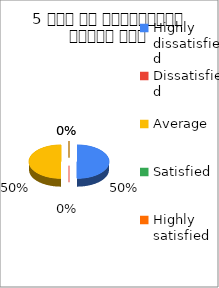
| Category | 5 समय पर पाठ्यक्रम  पूर्ण हुआ  |
|---|---|
| Highly dissatisfied | 1 |
| Dissatisfied | 0 |
| Average | 1 |
| Satisfied | 0 |
| Highly satisfied | 0 |